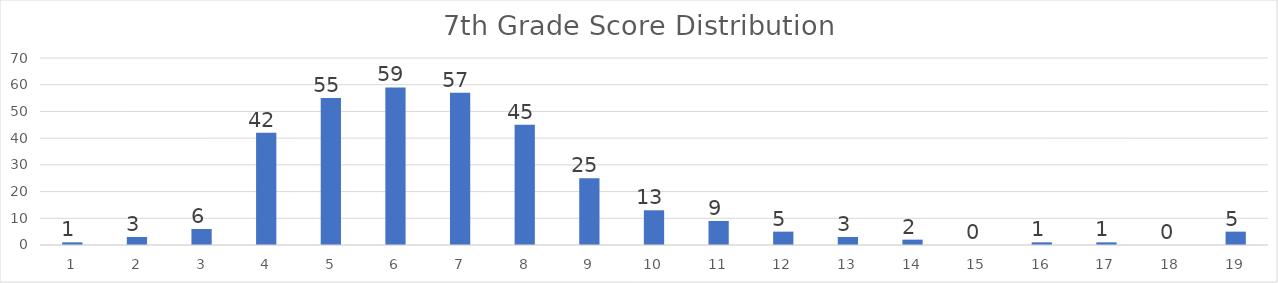
| Category | Series 0 |
|---|---|
| 0 | 1 |
| 1 | 3 |
| 2 | 6 |
| 3 | 42 |
| 4 | 55 |
| 5 | 59 |
| 6 | 57 |
| 7 | 45 |
| 8 | 25 |
| 9 | 13 |
| 10 | 9 |
| 11 | 5 |
| 12 | 3 |
| 13 | 2 |
| 14 | 0 |
| 15 | 1 |
| 16 | 1 |
| 17 | 0 |
| 18 | 5 |